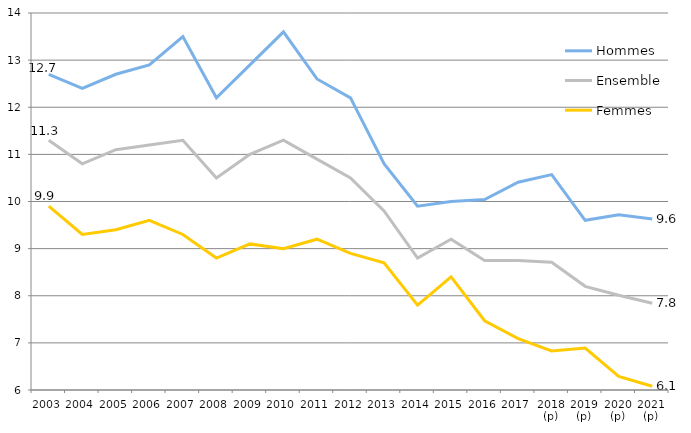
| Category | Hommes | Ensemble | Femmes |
|---|---|---|---|
| 2003 | 12.7 | 11.3 | 9.9 |
| 2004 | 12.4 | 10.8 | 9.3 |
| 2005 | 12.7 | 11.1 | 9.4 |
| 2006 | 12.9 | 11.2 | 9.6 |
| 2007 | 13.5 | 11.3 | 9.3 |
| 2008 | 12.2 | 10.5 | 8.8 |
| 2009 | 12.9 | 11 | 9.1 |
| 2010 | 13.6 | 11.3 | 9 |
| 2011 | 12.6 | 10.9 | 9.2 |
| 2012 | 12.2 | 10.5 | 8.9 |
| 2013 | 10.8 | 9.8 | 8.7 |
| 2014 | 9.9 | 8.8 | 7.8 |
| 2015 | 10 | 9.2 | 8.4 |
| 2016 | 10.04 | 8.75 | 7.47 |
| 2017 | 10.41 | 8.75 | 7.09 |
| 2018 (p) | 10.57 | 8.71 | 6.83 |
| 2019 (p) | 9.6 | 8.2 | 6.89 |
| 2020 (p) | 9.72 | 8.01 | 6.29 |
| 2021 (p) | 9.63 | 7.84 | 6.08 |